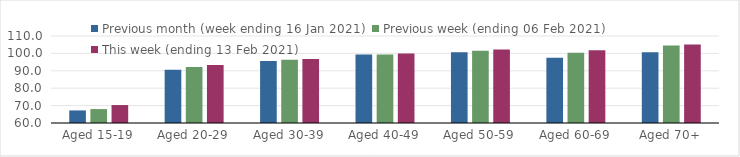
| Category | Previous month (week ending 16 Jan 2021) | Previous week (ending 06 Feb 2021) | This week (ending 13 Feb 2021) |
|---|---|---|---|
| Aged 15-19 | 67.23 | 67.99 | 70.32 |
| Aged 20-29 | 90.66 | 92.18 | 93.33 |
| Aged 30-39 | 95.61 | 96.3 | 96.84 |
| Aged 40-49 | 99.32 | 99.31 | 99.89 |
| Aged 50-59 | 100.64 | 101.59 | 102.26 |
| Aged 60-69 | 97.52 | 100.38 | 101.8 |
| Aged 70+ | 100.62 | 104.61 | 105.16 |